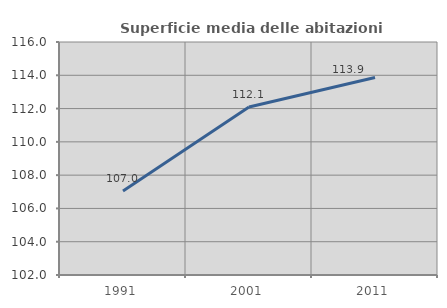
| Category | Superficie media delle abitazioni occupate |
|---|---|
| 1991.0 | 107.047 |
| 2001.0 | 112.098 |
| 2011.0 | 113.868 |